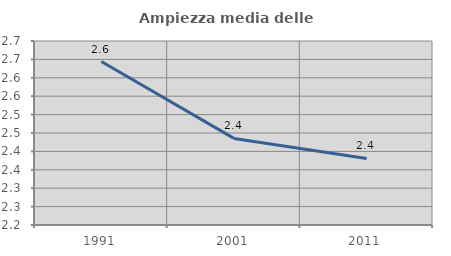
| Category | Ampiezza media delle famiglie |
|---|---|
| 1991.0 | 2.644 |
| 2001.0 | 2.435 |
| 2011.0 | 2.381 |